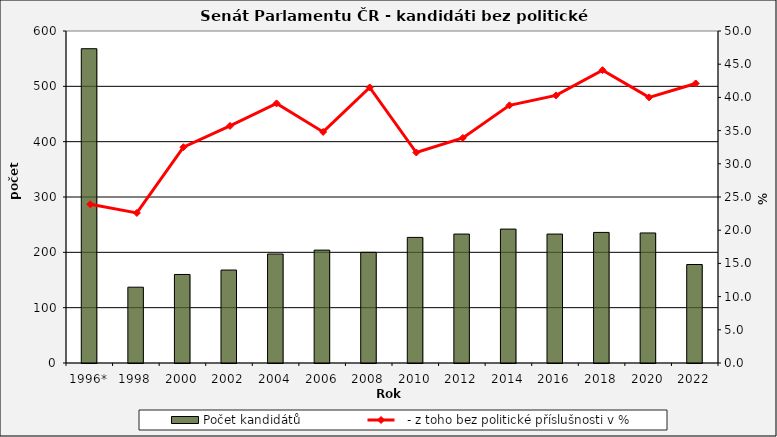
| Category | Počet kandidátů |
|---|---|
| 1996* | 568 |
| 1998 | 137 |
| 2000 | 160 |
| 2002 | 168 |
| 2004 | 197 |
| 2006 | 204 |
| 2008 | 200 |
| 2010 | 227 |
| 2012 | 233 |
| 2014 | 242 |
| 2016 | 233 |
| 2018 | 236 |
| 2020 | 235 |
| 2022 | 178 |